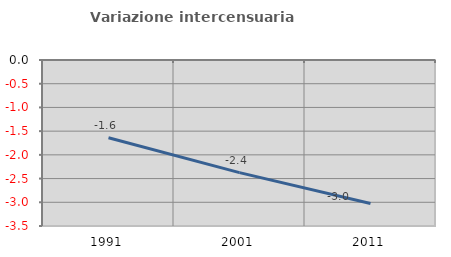
| Category | Variazione intercensuaria annua |
|---|---|
| 1991.0 | -1.638 |
| 2001.0 | -2.374 |
| 2011.0 | -3.024 |